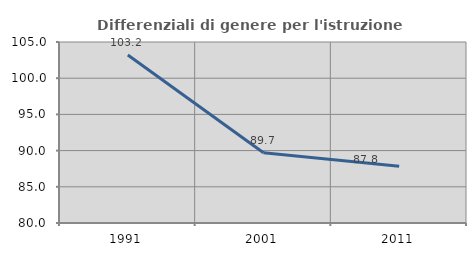
| Category | Differenziali di genere per l'istruzione superiore |
|---|---|
| 1991.0 | 103.214 |
| 2001.0 | 89.699 |
| 2011.0 | 87.823 |